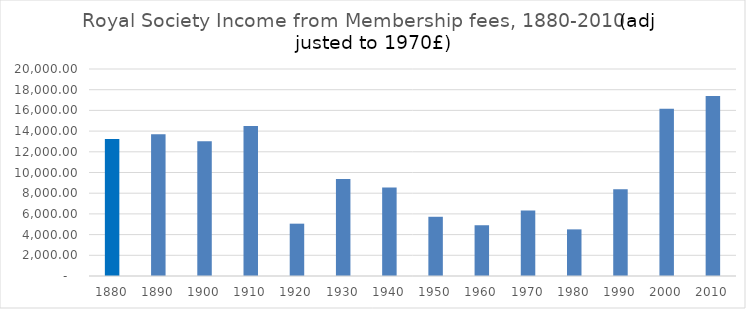
| Category | Fees |
|---|---|
| 1880.0 | 13245.5 |
| 1890.0 | 13703.48 |
| 1900.0 | 13008.411 |
| 1910.0 | 14495.951 |
| 1920.0 | 5056.306 |
| 1930.0 | 9378.128 |
| 1940.0 | 8554.224 |
| 1950.0 | 5722.771 |
| 1960.0 | 4904.346 |
| 1970.0 | 6340 |
| 1980.0 | 4504.953 |
| 1990.0 | 8393.338 |
| 2000.0 | 16167.851 |
| 2010.0 | 17397.593 |